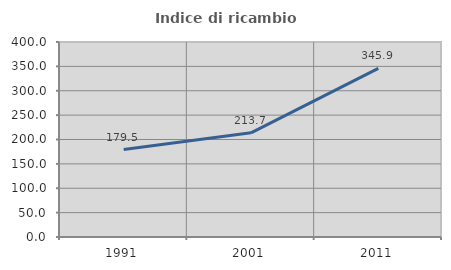
| Category | Indice di ricambio occupazionale  |
|---|---|
| 1991.0 | 179.464 |
| 2001.0 | 213.684 |
| 2011.0 | 345.946 |